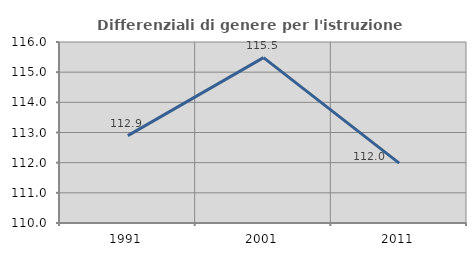
| Category | Differenziali di genere per l'istruzione superiore |
|---|---|
| 1991.0 | 112.897 |
| 2001.0 | 115.483 |
| 2011.0 | 111.984 |